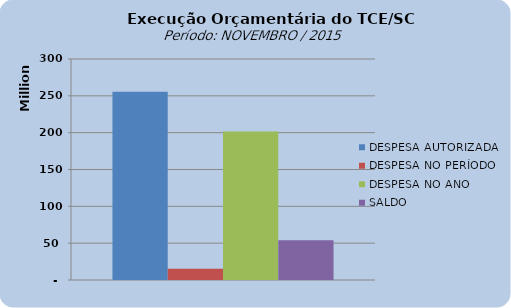
| Category | DESPESA AUTORIZADA | DESPESA NO PERÍODO | DESPESA NO ANO | SALDO |
|---|---|---|---|---|
| 0 | 255643030.2 | 15264215.68 | 201552441.62 | 54090588.58 |